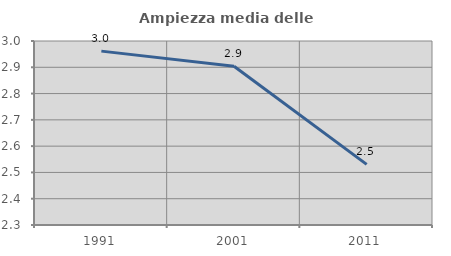
| Category | Ampiezza media delle famiglie |
|---|---|
| 1991.0 | 2.961 |
| 2001.0 | 2.904 |
| 2011.0 | 2.531 |